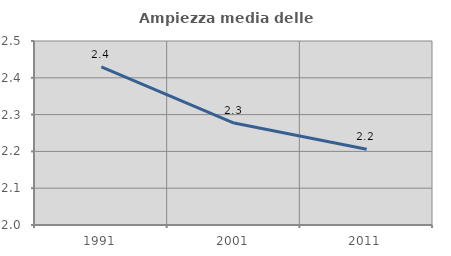
| Category | Ampiezza media delle famiglie |
|---|---|
| 1991.0 | 2.43 |
| 2001.0 | 2.277 |
| 2011.0 | 2.206 |